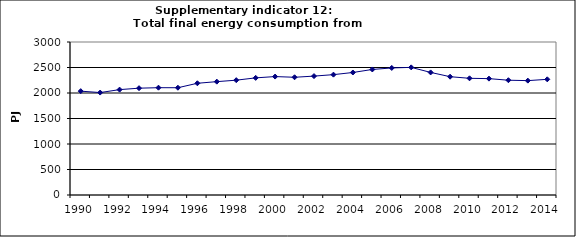
| Category | Total final energy consumption from transport, PJ |
|---|---|
| 1990 | 2036.25 |
| 1991 | 2008.534 |
| 1992 | 2066.395 |
| 1993 | 2094.405 |
| 1994 | 2103.993 |
| 1995 | 2103.365 |
| 1996 | 2190.592 |
| 1997 | 2222.459 |
| 1998 | 2251.326 |
| 1999 | 2296.589 |
| 2000 | 2322.046 |
| 2001 | 2308.488 |
| 2002 | 2331.413 |
| 2003 | 2359.923 |
| 2004 | 2402.141 |
| 2005 | 2461.552 |
| 2006 | 2491.207 |
| 2007 | 2502.489 |
| 2008 | 2403.523 |
| 2009 | 2319.809 |
| 2010 | 2288.148 |
| 2011 | 2281.692 |
| 2012 | 2250.731 |
| 2013 | 2242.574 |
| 2014 | 2268.283 |